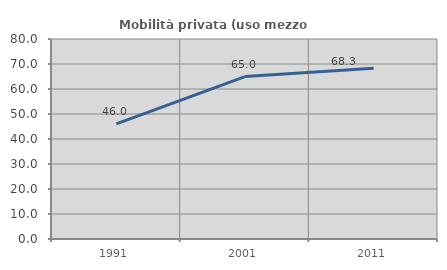
| Category | Mobilità privata (uso mezzo privato) |
|---|---|
| 1991.0 | 46.048 |
| 2001.0 | 64.983 |
| 2011.0 | 68.343 |